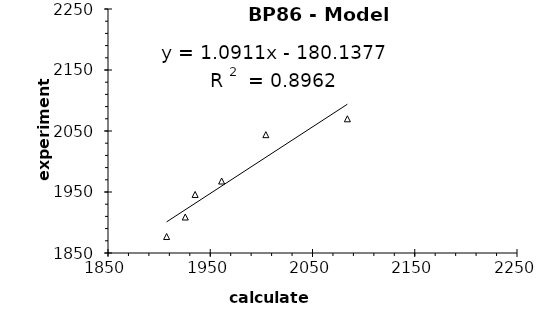
| Category | BP86 |
|---|---|
| 1907.3381712627 | 1877 |
| 1925.593613933237 | 1909 |
| 1935.201741654572 | 1946 |
| 1961.143686502177 | 1968 |
| 2004.380261248186 | 2044 |
| 2084.127721335269 | 2070 |